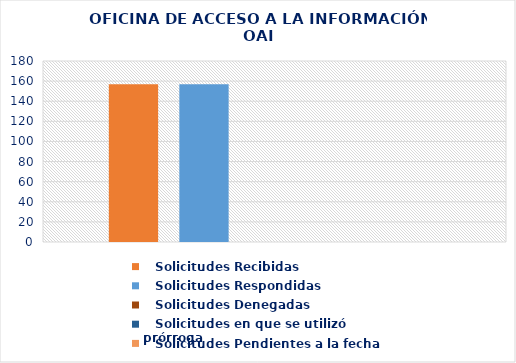
| Category |    Solicitudes Recibidas |    Solicitudes Respondidas |    Solicitudes Denegadas |    Solicitudes en que se utilizó prórroga |    Solicitudes Pendientes a la fecha |
|---|---|---|---|---|---|
| 0 | 157 | 157 | 0 | 0 | 0 |